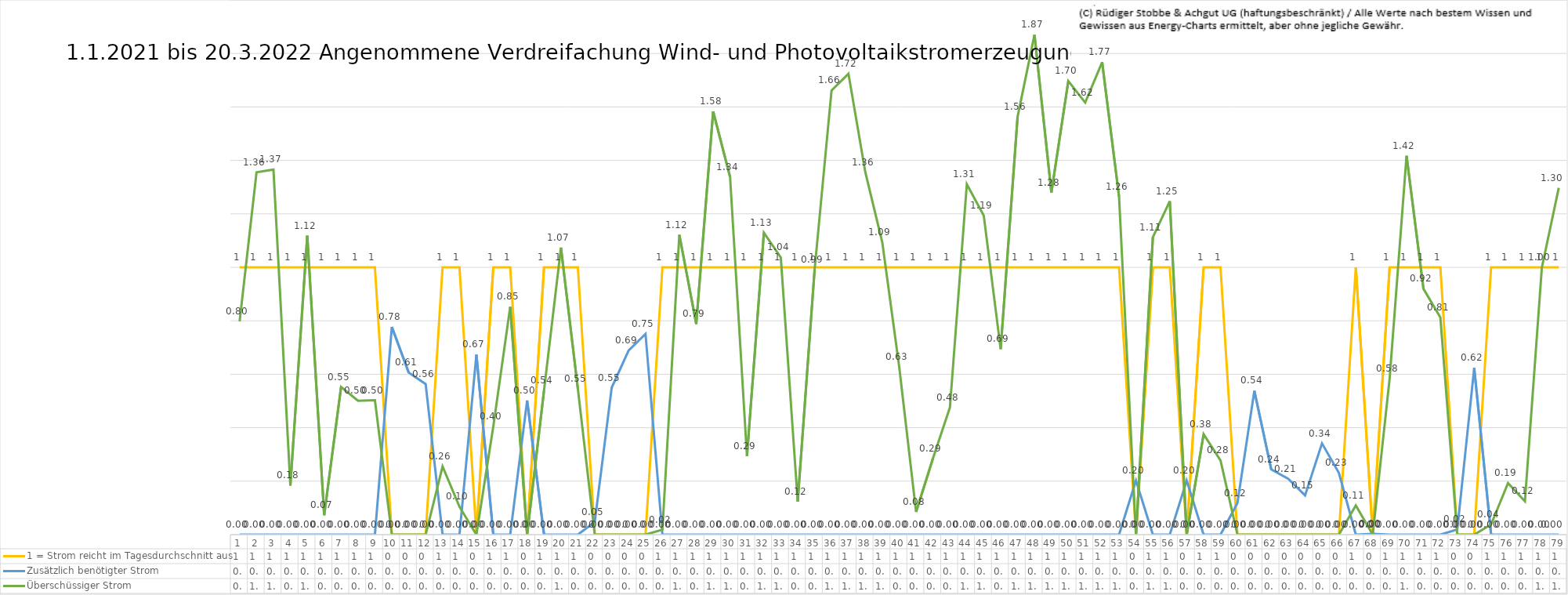
| Category | 1 = Strom reicht im Tagesdurchschnitt aus | Zusätzlich benötigter Strom | Überschüssiger Strom |
|---|---|---|---|
| 0 | 1 | 0 | 0.798 |
| 1 | 1 | 0 | 1.356 |
| 2 | 1 | 0 | 1.366 |
| 3 | 1 | 0 | 0.184 |
| 4 | 1 | 0 | 1.118 |
| 5 | 1 | 0 | 0.073 |
| 6 | 1 | 0 | 0.553 |
| 7 | 1 | 0 | 0.501 |
| 8 | 1 | 0 | 0.503 |
| 9 | 0 | 0.777 | 0 |
| 10 | 0 | 0.606 | 0 |
| 11 | 0 | 0.563 | 0 |
| 12 | 1 | 0 | 0.255 |
| 13 | 1 | 0 | 0.104 |
| 14 | 0 | 0.673 | 0 |
| 15 | 1 | 0 | 0.405 |
| 16 | 1 | 0 | 0.852 |
| 17 | 0 | 0.502 | 0 |
| 18 | 1 | 0 | 0.54 |
| 19 | 1 | 0 | 1.074 |
| 20 | 1 | 0 | 0.546 |
| 21 | 0 | 0.048 | 0 |
| 22 | 0 | 0.55 | 0 |
| 23 | 0 | 0.688 | 0 |
| 24 | 0 | 0.751 | 0 |
| 25 | 1 | 0 | 0.018 |
| 26 | 1 | 0 | 1.121 |
| 27 | 1 | 0 | 0.788 |
| 28 | 1 | 0 | 1.583 |
| 29 | 1 | 0 | 1.338 |
| 30 | 1 | 0 | 0.293 |
| 31 | 1 | 0 | 1.13 |
| 32 | 1 | 0 | 1.037 |
| 33 | 1 | 0 | 0.123 |
| 34 | 1 | 0 | 0.992 |
| 35 | 1 | 0 | 1.662 |
| 36 | 1 | 0 | 1.724 |
| 37 | 1 | 0 | 1.355 |
| 38 | 1 | 0 | 1.094 |
| 39 | 1 | 0 | 0.628 |
| 40 | 1 | 0 | 0.085 |
| 41 | 1 | 0 | 0.286 |
| 42 | 1 | 0 | 0.476 |
| 43 | 1 | 0 | 1.311 |
| 44 | 1 | 0 | 1.194 |
| 45 | 1 | 0 | 0.694 |
| 46 | 1 | 0 | 1.563 |
| 47 | 1 | 0 | 1.87 |
| 48 | 1 | 0 | 1.28 |
| 49 | 1 | 0 | 1.697 |
| 50 | 1 | 0 | 1.616 |
| 51 | 1 | 0 | 1.767 |
| 52 | 1 | 0 | 1.264 |
| 53 | 0 | 0.202 | 0 |
| 54 | 1 | 0 | 1.112 |
| 55 | 1 | 0 | 1.247 |
| 56 | 0 | 0.202 | 0 |
| 57 | 1 | 0 | 0.376 |
| 58 | 1 | 0 | 0.278 |
| 59 | 0 | 0.118 | 0 |
| 60 | 0 | 0.538 | 0 |
| 61 | 0 | 0.244 | 0 |
| 62 | 0 | 0.209 | 0 |
| 63 | 0 | 0.147 | 0 |
| 64 | 0 | 0.341 | 0 |
| 65 | 0 | 0.231 | 0 |
| 66 | 1 | 0 | 0.11 |
| 67 | 0 | 0.003 | 0 |
| 68 | 1 | 0 | 0.584 |
| 69 | 1 | 0 | 1.417 |
| 70 | 1 | 0 | 0.92 |
| 71 | 1 | 0 | 0.813 |
| 72 | 0 | 0.019 | 0 |
| 73 | 0 | 0.624 | 0 |
| 74 | 1 | 0 | 0.038 |
| 75 | 1 | 0 | 0.193 |
| 76 | 1 | 0 | 0.125 |
| 77 | 1 | 0 | 0.999 |
| 78 | 1 | 0 | 1.297 |